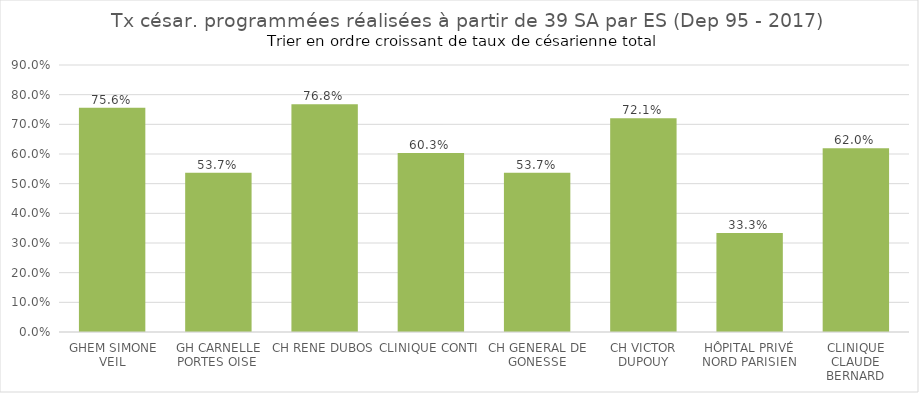
| Category | Tx césar. programmées 
réalisées à partir de 39 SA |
|---|---|
| GHEM SIMONE VEIL | 0.756 |
| GH CARNELLE PORTES OISE  | 0.537 |
| CH RENE DUBOS | 0.768 |
| CLINIQUE CONTI | 0.603 |
| CH GENERAL DE GONESSE | 0.537 |
| CH VICTOR DUPOUY | 0.721 |
| HÔPITAL PRIVÉ NORD PARISIEN | 0.333 |
| CLINIQUE CLAUDE BERNARD | 0.62 |